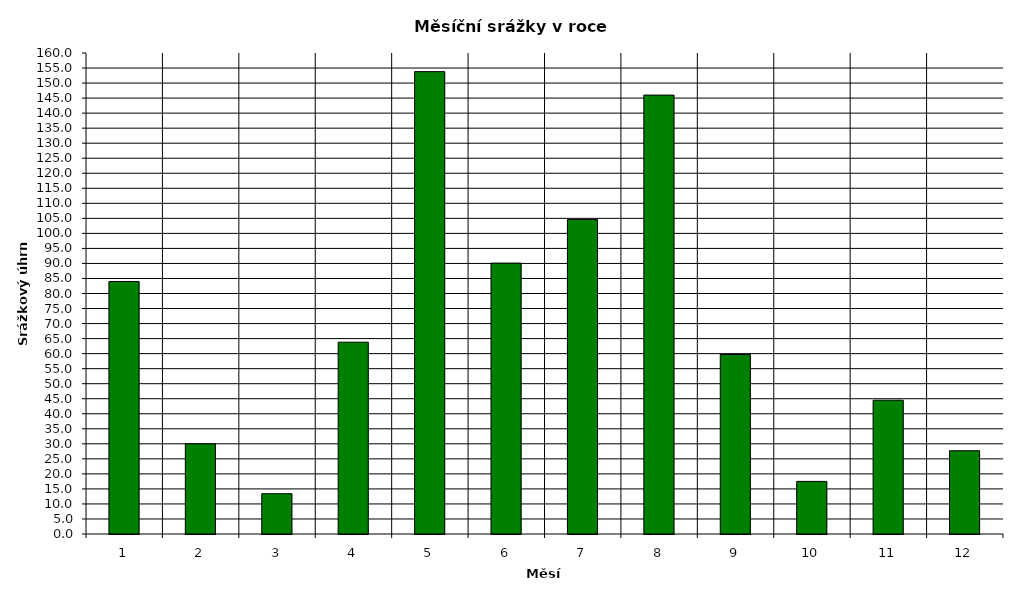
| Category | Series 0 |
|---|---|
| 0 | 84 |
| 1 | 30 |
| 2 | 13.4 |
| 3 | 63.8 |
| 4 | 153.8 |
| 5 | 90.1 |
| 6 | 104.6 |
| 7 | 146 |
| 8 | 59.7 |
| 9 | 17.5 |
| 10 | 44.5 |
| 11 | 27.7 |